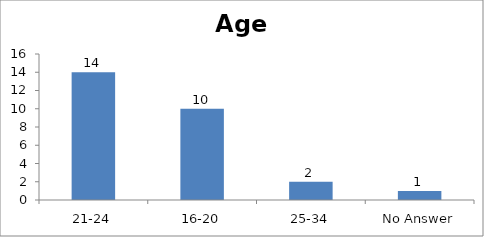
| Category | Age |
|---|---|
| 21-24 | 14 |
| 16-20 | 10 |
| 25-34 | 2 |
| No Answer | 1 |